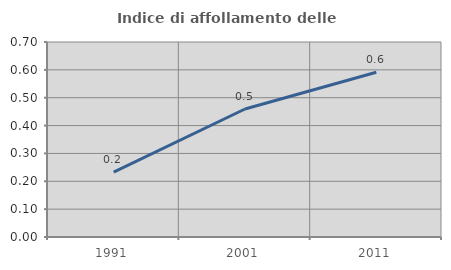
| Category | Indice di affollamento delle abitazioni  |
|---|---|
| 1991.0 | 0.233 |
| 2001.0 | 0.46 |
| 2011.0 | 0.591 |